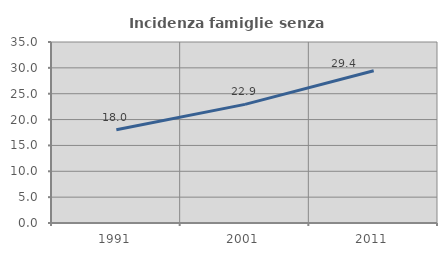
| Category | Incidenza famiglie senza nuclei |
|---|---|
| 1991.0 | 18.036 |
| 2001.0 | 22.944 |
| 2011.0 | 29.43 |